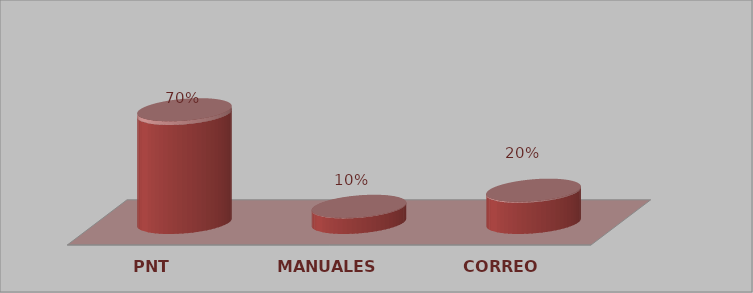
| Category | Series 0 | Series 1 |
|---|---|---|
| PNT | 21 | 0.7 |
| MANUALES | 3 | 0.1 |
| CORREO | 6 | 0.2 |